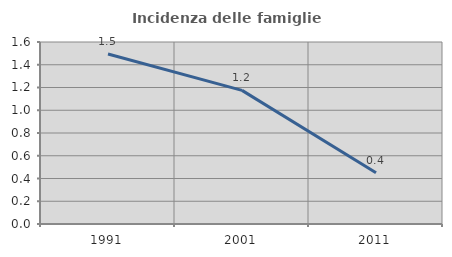
| Category | Incidenza delle famiglie numerose |
|---|---|
| 1991.0 | 1.495 |
| 2001.0 | 1.174 |
| 2011.0 | 0.45 |